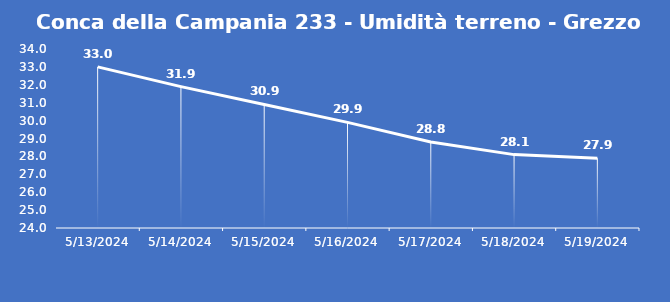
| Category | Conca della Campania 233 - Umidità terreno - Grezzo (%VWC) |
|---|---|
| 5/13/24 | 33 |
| 5/14/24 | 31.9 |
| 5/15/24 | 30.9 |
| 5/16/24 | 29.9 |
| 5/17/24 | 28.8 |
| 5/18/24 | 28.1 |
| 5/19/24 | 27.9 |